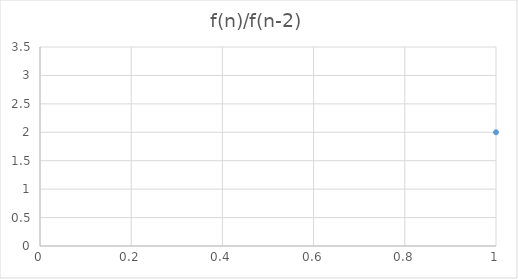
| Category | Series 0 |
|---|---|
| 0 | 2 |
| 1 | 3 |
| 2 | 2.5 |
| 3 | 2.667 |
| 4 | 2.6 |
| 5 | 2.625 |
| 6 | 2.615 |
| 7 | 2.619 |
| 8 | 2.618 |
| 9 | 2.618 |
| 10 | 2.618 |
| 11 | 2.618 |
| 12 | 2.618 |
| 13 | 2.618 |
| 14 | 2.618 |
| 15 | 2.618 |
| 16 | 2.618 |
| 17 | 2.618 |
| 18 | 2.618 |
| 19 | 2.618 |
| 20 | 2.618 |
| 21 | 2.618 |
| 22 | 2.618 |
| 23 | 2.618 |
| 24 | 2.618 |
| 25 | 2.618 |
| 26 | 2.618 |
| 27 | 2.618 |
| 28 | 2.618 |
| 29 | 2.618 |
| 30 | 2.618 |
| 31 | 2.618 |
| 32 | 2.618 |
| 33 | 2.618 |
| 34 | 2.618 |
| 35 | 2.618 |
| 36 | 2.618 |
| 37 | 2.618 |
| 38 | 2.618 |
| 39 | 2.618 |
| 40 | 2.618 |
| 41 | 2.618 |
| 42 | 2.618 |
| 43 | 2.618 |
| 44 | 2.618 |
| 45 | 2.618 |
| 46 | 2.618 |
| 47 | 2.618 |
| 48 | 2.618 |
| 49 | 2.618 |
| 50 | 2.618 |
| 51 | 2.618 |
| 52 | 2.618 |
| 53 | 2.618 |
| 54 | 2.618 |
| 55 | 2.618 |
| 56 | 2.618 |
| 57 | 2.618 |
| 58 | 2.618 |
| 59 | 2.618 |
| 60 | 2.618 |
| 61 | 2.618 |
| 62 | 2.618 |
| 63 | 2.618 |
| 64 | 2.618 |
| 65 | 2.618 |
| 66 | 2.618 |
| 67 | 2.618 |
| 68 | 2.618 |
| 69 | 2.618 |
| 70 | 2.618 |
| 71 | 2.618 |
| 72 | 2.618 |
| 73 | 2.618 |
| 74 | 2.618 |
| 75 | 2.618 |
| 76 | 2.618 |
| 77 | 2.618 |
| 78 | 2.618 |
| 79 | 2.618 |
| 80 | 2.618 |
| 81 | 2.618 |
| 82 | 2.618 |
| 83 | 2.618 |
| 84 | 2.618 |
| 85 | 2.618 |
| 86 | 2.618 |
| 87 | 2.618 |
| 88 | 2.618 |
| 89 | 2.618 |
| 90 | 2.618 |
| 91 | 2.618 |
| 92 | 2.618 |
| 93 | 2.618 |
| 94 | 2.618 |
| 95 | 2.618 |
| 96 | 2.618 |
| 97 | 2.618 |